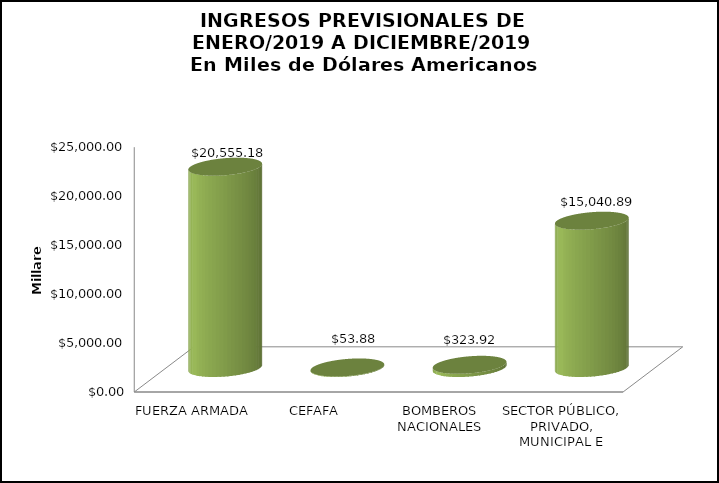
| Category | MONTO ANUAL |
|---|---|
| FUERZA ARMADA | 20555179.74 |
| CEFAFA | 53876.54 |
| BOMBEROS NACIONALES | 323923.78 |
| SECTOR PÚBLICO, PRIVADO, MUNICIPAL E INDEPENDIENTE | 15040891.57 |